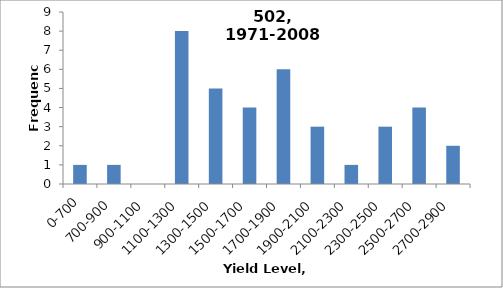
| Category | Frequency |
|---|---|
| 0-700 | 1 |
| 700-900 | 1 |
| 900-1100 | 0 |
| 1100-1300 | 8 |
| 1300-1500 | 5 |
| 1500-1700 | 4 |
| 1700-1900 | 6 |
| 1900-2100 | 3 |
| 2100-2300 | 1 |
| 2300-2500 | 3 |
| 2500-2700 | 4 |
| 2700-2900 | 2 |